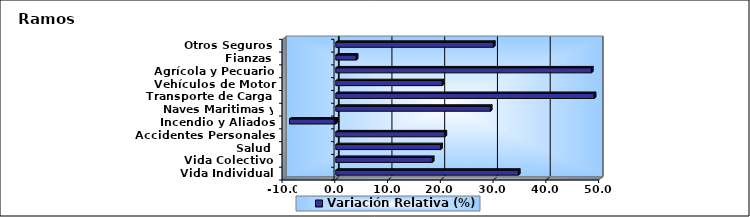
| Category | Variación Relativa (%) |
|---|---|
| Vida Individual | 34.608 |
| Vida Colectivo | 18.305 |
| Salud | 19.872 |
| Accidentes Personales | 20.695 |
| Incendio y Aliados | -8.776 |
| Naves Maritimas y Aéreas | 29.298 |
| Transporte de Carga | 48.984 |
| Vehículos de Motor | 20.185 |
| Agrícola y Pecuario | 48.453 |
| Fianzas | 3.872 |
| Otros Seguros | 29.88 |